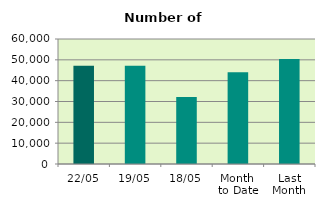
| Category | Series 0 |
|---|---|
| 22/05 | 47116 |
| 19/05 | 47190 |
| 18/05 | 32118 |
| Month 
to Date | 44003.067 |
| Last
Month | 50445.556 |